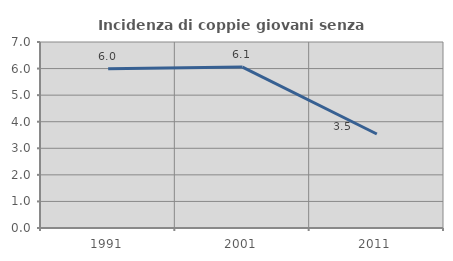
| Category | Incidenza di coppie giovani senza figli |
|---|---|
| 1991.0 | 5.989 |
| 2001.0 | 6.057 |
| 2011.0 | 3.538 |